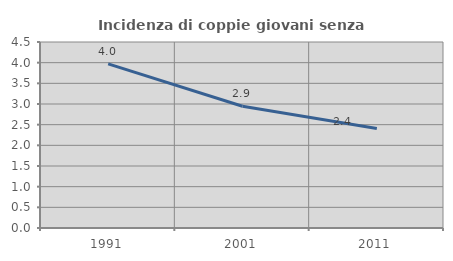
| Category | Incidenza di coppie giovani senza figli |
|---|---|
| 1991.0 | 3.97 |
| 2001.0 | 2.947 |
| 2011.0 | 2.41 |